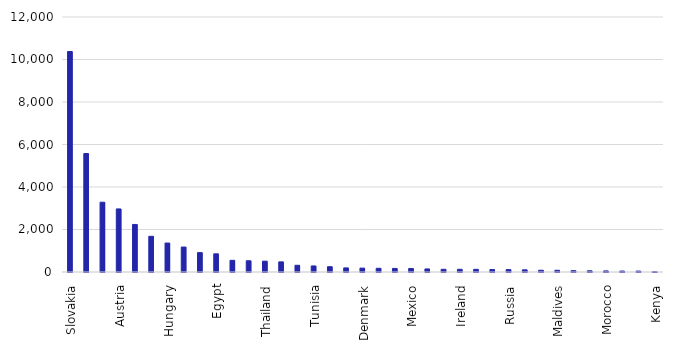
| Category | Number of Google reviews |
|---|---|
| Slovakia | 10376 |
| Croatia | 5575 |
| Italy | 3284 |
| Austria | 2968 |
| Greece | 2237 |
| Spain | 1680 |
| Hungary | 1363 |
| Germany | 1175 |
| Poland | 913 |
| Egypt | 855 |
| United Kingdom | 550 |
| Bulgaria | 528 |
| Thailand | 510 |
| France | 476 |
| Sri Lanka | 316 |
| Tunisia | 285 |
| Portugal | 250 |
| Dominican Republic | 193 |
| Denmark | 182 |
| Turkey | 174 |
| Vietnam | 167 |
| Mexico | 163 |
| Holland | 144 |
| Bali | 127 |
| Ireland | 126 |
| USA | 125 |
| Switzerland | 114 |
| Russia | 112 |
| Belgium | 102 |
| Zanzibar | 83 |
| Maldives | 81 |
| UAE | 63 |
| Sweden | 57 |
| Morocco | 51 |
| Norway | 45 |
| Romania | 42 |
| Kenya | 13 |